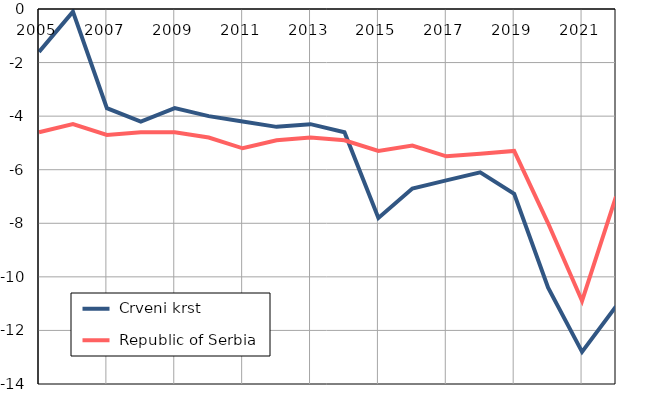
| Category |  Crveni krst |  Republic of Serbia |
|---|---|---|
| 2005.0 | -1.6 | -4.6 |
| 2006.0 | -0.1 | -4.3 |
| 2007.0 | -3.7 | -4.7 |
| 2008.0 | -4.2 | -4.6 |
| 2009.0 | -3.7 | -4.6 |
| 2010.0 | -4 | -4.8 |
| 2011.0 | -4.2 | -5.2 |
| 2012.0 | -4.4 | -4.9 |
| 2013.0 | -4.3 | -4.8 |
| 2014.0 | -4.6 | -4.9 |
| 2015.0 | -7.8 | -5.3 |
| 2016.0 | -6.7 | -5.1 |
| 2017.0 | -6.4 | -5.5 |
| 2018.0 | -6.1 | -5.4 |
| 2019.0 | -6.9 | -5.3 |
| 2020.0 | -10.4 | -8 |
| 2021.0 | -12.8 | -10.9 |
| 2022.0 | -11.1 | -7 |